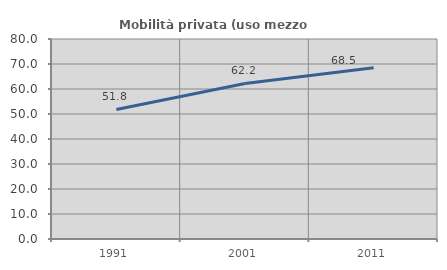
| Category | Mobilità privata (uso mezzo privato) |
|---|---|
| 1991.0 | 51.821 |
| 2001.0 | 62.215 |
| 2011.0 | 68.494 |